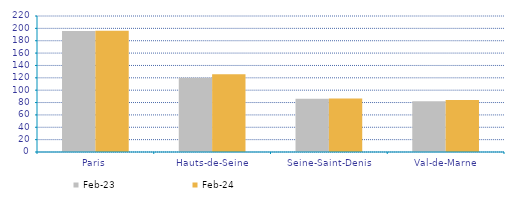
| Category | févr-23 | févr-24 |
|---|---|---|
| Paris | 195.705 | 196.304 |
| Hauts-de-Seine | 120.183 | 125.674 |
| Seine-Saint-Denis | 86.319 | 86.623 |
| Val-de-Marne | 82.13 | 84.193 |